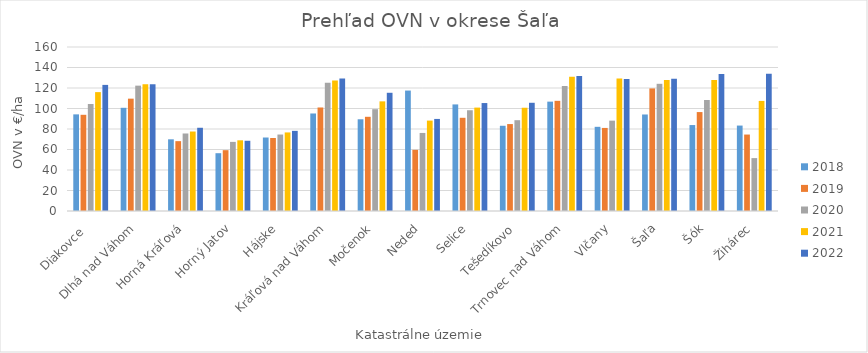
| Category | 2018 | 2019 | 2020 | 2021 | 2022 |
|---|---|---|---|---|---|
| Diakovce  | 94.28 | 93.86 | 104.41 | 115.98 | 123.03 |
| Dlhá nad Váhom | 100.67 | 109.6 | 122.3 | 123.67 | 123.65 |
| Horná Kráľová | 69.94 | 68.15 | 75.62 | 77.54 | 81.21 |
| Horný Jatov | 56.39 | 59.34 | 67.43 | 68.97 | 68.52 |
| Hájske | 71.7 | 71.21 | 74.61 | 76.65 | 78.18 |
| Kráľová nad Váhom | 95.14 | 100.99 | 125.24 | 127.27 | 129.26 |
| Močenok | 89.49 | 91.91 | 99.34 | 106.97 | 115.34 |
| Neded | 117.5 | 59.65 | 76.15 | 88.21 | 89.82 |
| Selice | 103.98 | 90.94 | 98.3 | 100.89 | 105.32 |
| Tešedíkovo | 83.15 | 84.81 | 88.6 | 100.74 | 105.58 |
| Trnovec nad Váhom | 106.69 | 107.48 | 121.95 | 131.06 | 131.77 |
| Vlčany | 82.13 | 81.04 | 88.15 | 129.24 | 128.71 |
| Šaľa | 94.16 | 119.59 | 124.1 | 127.87 | 129.06 |
| Šók | 83.85 | 96.52 | 108.3 | 127.69 | 133.61 |
| Žihárec | 83.35 | 74.59 | 51.61 | 107.41 | 134.01 |